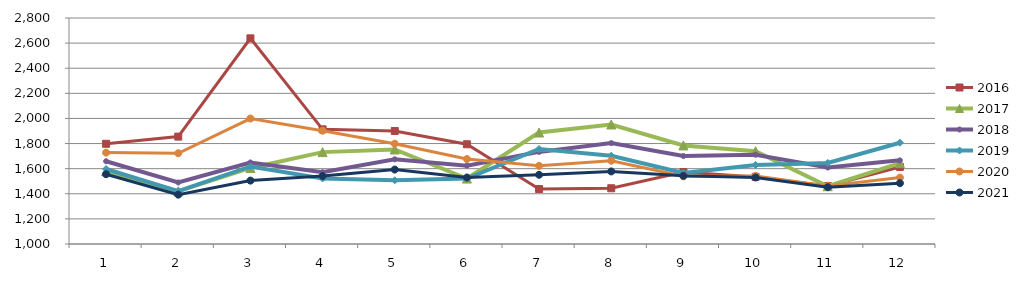
| Category | 2015 | 2016 | 2017 | 2018 | 2019 | 2020 | 2021 |
|---|---|---|---|---|---|---|---|
| 0 |  | 1798.146 | 1579.519 | 1659.233 | 1597.182 | 1727.767 | 1555.724 |
| 1 |  | 1855.266 | 1419.892 | 1490.116 | 1420.981 | 1722.949 | 1392.893 |
| 2 |  | 2637.962 | 1605.876 | 1649.429 | 1617.601 | 1999.15 | 1504.855 |
| 3 |  | 1913.237 | 1731.762 | 1571.732 | 1521.999 | 1902.268 | 1541.039 |
| 4 |  | 1900.309 | 1752.669 | 1674.727 | 1507.654 | 1798.925 | 1592.865 |
| 5 |  | 1794.333 | 1521.303 | 1624.201 | 1521.033 | 1676.477 | 1529.566 |
| 6 |  | 1437.75 | 1887.908 | 1733.621 | 1757.049 | 1622.712 | 1551.412 |
| 7 |  | 1443.965 | 1951.735 | 1803.444 | 1702.894 | 1663.262 | 1577.956 |
| 8 |  | 1573.366 | 1785.145 | 1700.265 | 1565.361 | 1539.017 | 1542.78 |
| 9 |  | 1534.523 | 1739.554 | 1710.862 | 1629.894 | 1542.307 | 1529.928 |
| 10 |  | 1461.686 | 1460 | 1609.178 | 1645.62 | 1461.483 | 1452.733 |
| 11 |  | 1613.843 | 1644.49 | 1666.129 | 1806.739 | 1529.116 | 1484.399 |